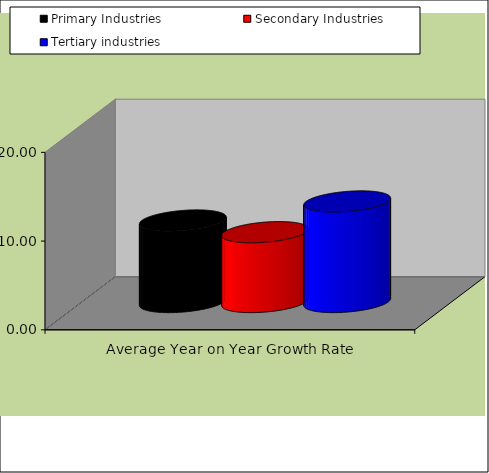
| Category | Primary Industries | Secondary Industries | Tertiary industries |
|---|---|---|---|
| Average Year on Year Growth Rate | 9.184 | 7.869 | 11.33 |